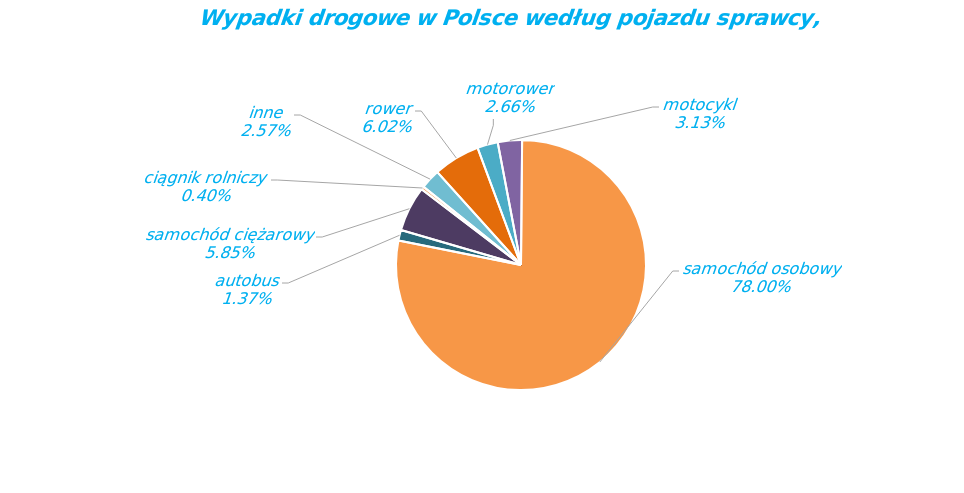
| Category | Series 0 |
|---|---|
| rower | 1644 |
| motorower | 726 |
| motocykl | 855 |
| samochód osobowy | 21299 |
| autobus | 373 |
| samochód ciężarowy | 1598 |
| ciągnik rolniczy | 110 |
| inne | 702 |